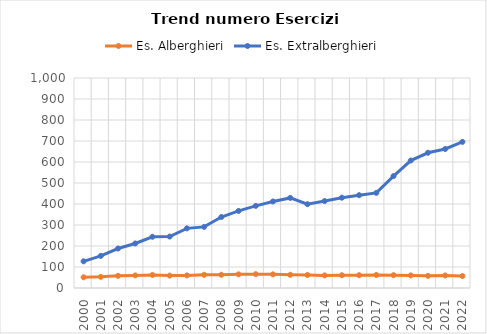
| Category | Es. Alberghieri | Es. Extralberghieri |
|---|---|---|
| 2000.0 | 51 | 127 |
| 2001.0 | 53 | 153 |
| 2002.0 | 58 | 188 |
| 2003.0 | 60 | 212 |
| 2004.0 | 62 | 244 |
| 2005.0 | 59 | 245 |
| 2006.0 | 60 | 284 |
| 2007.0 | 63 | 291 |
| 2008.0 | 63 | 338 |
| 2009.0 | 65 | 367 |
| 2010.0 | 66 | 391 |
| 2011.0 | 65 | 412 |
| 2012.0 | 63 | 429 |
| 2013.0 | 62 | 399 |
| 2014.0 | 60 | 414 |
| 2015.0 | 61 | 430 |
| 2016.0 | 61 | 442 |
| 2017.0 | 62 | 453 |
| 2018.0 | 61 | 533 |
| 2019.0 | 60 | 607 |
| 2020.0 | 58 | 644 |
| 2021.0 | 60 | 662 |
| 2022.0 | 57 | 696 |